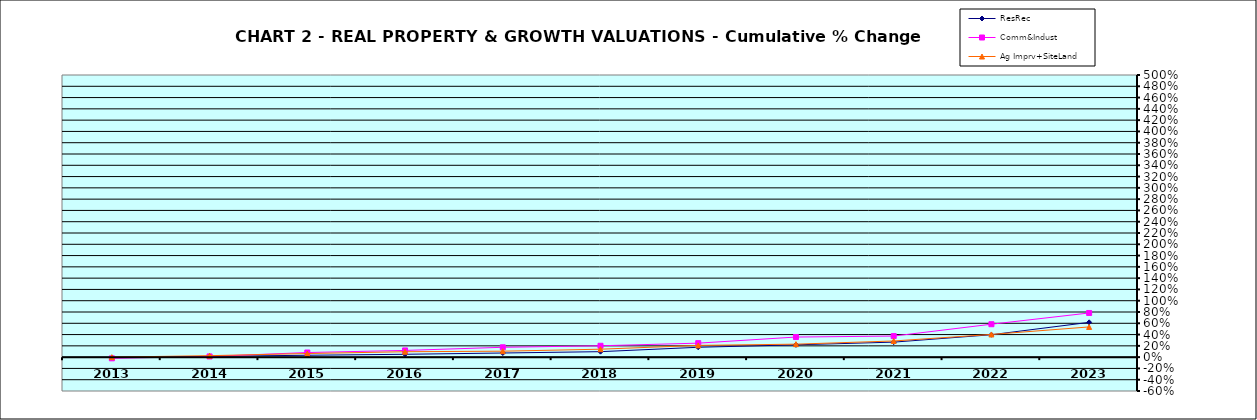
| Category | ResRec | Comm&Indust | Ag Imprv+SiteLand |
|---|---|---|---|
| 2013.0 | -0.008 | -0.021 | 0 |
| 2014.0 | 0.014 | 0.012 | 0.026 |
| 2015.0 | 0.033 | 0.082 | 0.064 |
| 2016.0 | 0.051 | 0.119 | 0.096 |
| 2017.0 | 0.073 | 0.175 | 0.105 |
| 2018.0 | 0.097 | 0.201 | 0.141 |
| 2019.0 | 0.175 | 0.248 | 0.208 |
| 2020.0 | 0.218 | 0.356 | 0.23 |
| 2021.0 | 0.266 | 0.374 | 0.286 |
| 2022.0 | 0.397 | 0.584 | 0.402 |
| 2023.0 | 0.616 | 0.783 | 0.535 |